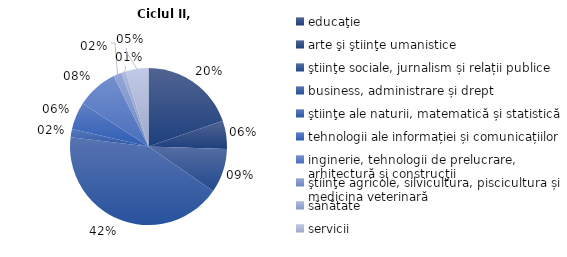
| Category | 2020/21 |
|---|---|
| educaţie | 19.7 |
| arte şi ştiinţe umanistice | 5.8 |
| ştiinţe sociale, jurnalism și relații publice   | 9.1 |
| business, administrare și drept | 42.3 |
| ştiinţe ale naturii, matematică și statistică | 1.7 |
| tehnologii ale informației și comunicațiilor  | 5.6 |
| inginerie, tehnologii de prelucrare, arhitectură și construcţii | 8.5 |
| ştiinţe agricole, silvicultura, piscicultura și  medicina veterinară | 1.7 |
| sănătate | 0.9 |
| servicii | 4.7 |